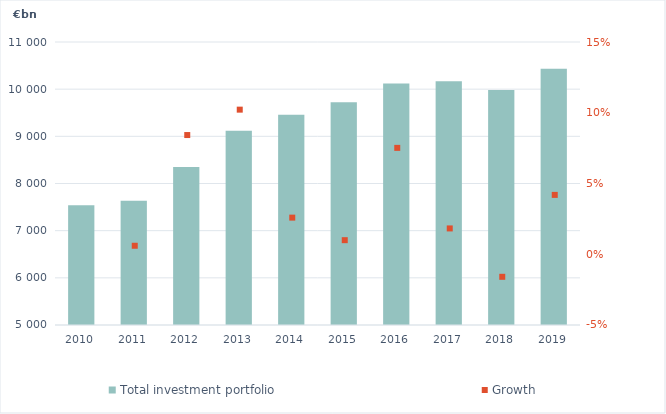
| Category | Total investment portfolio |
|---|---|
| 2010.0 | 7536.44 |
| 2011.0 | 7636.834 |
| 2012.0 | 8348.789 |
| 2013.0 | 9116.116 |
| 2014.0 | 9458.558 |
| 2015.0 | 9721.514 |
| 2016.0 | 10118.663 |
| 2017.0 | 10166.83 |
| 2018.0 | 9981.492 |
| 2019.0 | 10431.662 |